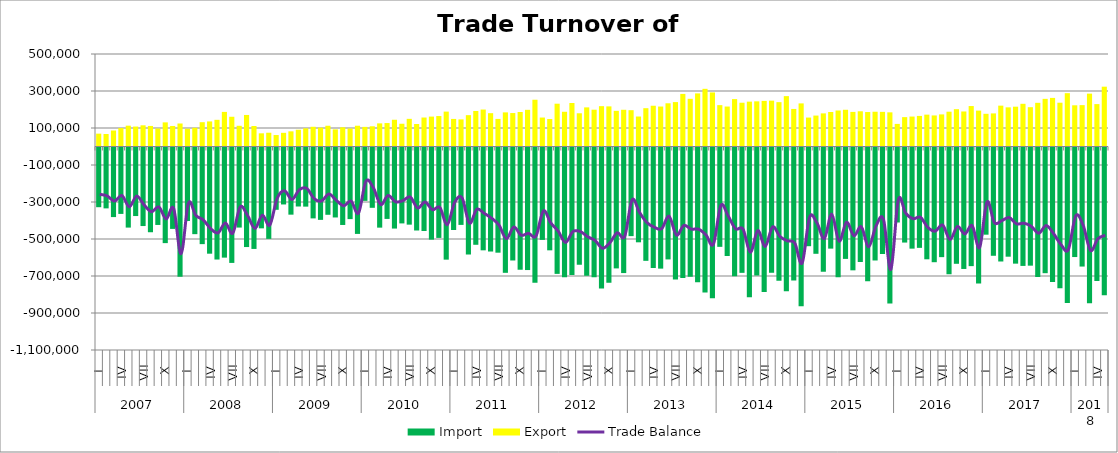
| Category | Import | Export |
|---|---|---|
| 0 | -328137.428 | 69473.835 |
| 1 | -334459.902 | 67469.561 |
| 2 | -381545.727 | 86485.258 |
| 3 | -364407.83 | 99579.043 |
| 4 | -438345.425 | 112612.284 |
| 5 | -375919.942 | 107918.489 |
| 6 | -429942.484 | 114501.191 |
| 7 | -463469.136 | 111126.511 |
| 8 | -424050.769 | 97183.969 |
| 9 | -522267.672 | 130413.835 |
| 10 | -445390.926 | 110997.546 |
| 11 | -704213.005 | 124348.947 |
| 12 | -402575.025 | 96157.037 |
| 13 | -473805.365 | 101214.427 |
| 14 | -527726.957 | 131397.232 |
| 15 | -579390.37 | 135532.592 |
| 16 | -610953.408 | 144223.295 |
| 17 | -600700.531 | 187019.429 |
| 18 | -629238.431 | 160784.767 |
| 19 | -438214.751 | 112046.47 |
| 20 | -543482.238 | 170475.427 |
| 21 | -553710.327 | 110823.513 |
| 22 | -442400.172 | 71226.822 |
| 23 | -499342.768 | 74444.228 |
| 24 | -342172.891 | 61992.595 |
| 25 | -313305.2 | 73882.564 |
| 26 | -368421.542 | 81964.131 |
| 27 | -324331.62 | 90575.384 |
| 28 | -325013.796 | 98333.759 |
| 29 | -388587.943 | 106636.938 |
| 30 | -396599.106 | 102008.498 |
| 31 | -369105.39 | 112226.511 |
| 32 | -383616.972 | 92627.175 |
| 33 | -424156.143 | 103821.906 |
| 34 | -392445.75 | 97243.451 |
| 35 | -472487.714 | 112309.489 |
| 36 | -293895.433 | 106064.492 |
| 37 | -331405.786 | 109307.304 |
| 38 | -438593.88 | 125094.217 |
| 39 | -391466.377 | 126732.826 |
| 40 | -443586.207 | 144566.325 |
| 41 | -415754.856 | 123019.4 |
| 42 | -422418.39 | 149517.049 |
| 43 | -454069.86 | 121491.454 |
| 44 | -456766.108 | 156666.699 |
| 45 | -503426.607 | 161726.515 |
| 46 | -494134.733 | 164687.607 |
| 47 | -611604.197 | 188598.168 |
| 48 | -451309.458 | 149010.644 |
| 49 | -423793.525 | 146578.748 |
| 50 | -583825.022 | 169493.189 |
| 51 | -531280.086 | 191970.173 |
| 52 | -561216.825 | 199783.493 |
| 53 | -567722.238 | 180198.594 |
| 54 | -573950.28 | 149150.663 |
| 55 | -682821.526 | 184407.918 |
| 56 | -616128.006 | 180852.789 |
| 57 | -666126.682 | 186641.23 |
| 58 | -667818.752 | 198251.768 |
| 59 | -736741.388 | 252796.62 |
| 60 | -504795.744 | 156548.304 |
| 61 | -561245.241 | 148452.793 |
| 62 | -688545.632 | 231354.031 |
| 63 | -706187.659 | 187713.44 |
| 64 | -694827.44 | 235062.822 |
| 65 | -639198.689 | 179645.423 |
| 66 | -699314.296 | 211478.747 |
| 67 | -707051.188 | 198935.781 |
| 68 | -768121.772 | 218103.736 |
| 69 | -737103.652 | 216869.809 |
| 70 | -658928.109 | 192707.068 |
| 71 | -684156.84 | 198511.792 |
| 72 | -484510.166 | 196270.253 |
| 73 | -517895.062 | 162100.421 |
| 74 | -618028.057 | 207058.123 |
| 75 | -656766.022 | 220319.968 |
| 76 | -660133.83 | 216011.247 |
| 77 | -610381.872 | 233583.127 |
| 78 | -718870.489 | 240016.286 |
| 79 | -710962.361 | 284268.477 |
| 80 | -704339.98 | 257853.114 |
| 81 | -734189.374 | 287023.64 |
| 82 | -789551.275 | 311739.566 |
| 83 | -820086.931 | 292254.741 |
| 84 | -542427.286 | 223612.854 |
| 85 | -591950.372 | 216056.361 |
| 86 | -701034.248 | 256202.016 |
| 87 | -682942.999 | 236606.206 |
| 88 | -814368.234 | 242506.121 |
| 89 | -697796.037 | 244083.524 |
| 90 | -787009.075 | 246465.522 |
| 91 | -682549.858 | 247769.838 |
| 92 | -726340.963 | 239731.245 |
| 93 | -782290.909 | 272322.182 |
| 94 | -724680.114 | 202926.728 |
| 95 | -862879.859 | 233012.969 |
| 96 | -538891.152 | 156419.793 |
| 97 | -579977.504 | 167210.896 |
| 98 | -676965.059 | 179075.373 |
| 99 | -552058.464 | 186554.958 |
| 100 | -706417.657 | 194612.062 |
| 101 | -607536.095 | 198583.755 |
| 102 | -669370.322 | 187036.287 |
| 103 | -624263.369 | 190362.202 |
| 104 | -728605.63 | 186333.061 |
| 105 | -616128.302 | 187914.12 |
| 106 | -581222.627 | 187288.327 |
| 107 | -848666.858 | 184620.727 |
| 108 | -410772.702 | 122160.969 |
| 109 | -519251.619 | 158749.443 |
| 110 | -552107.01 | 161900.102 |
| 111 | -547894.926 | 165302.85 |
| 112 | -609712.575 | 172239.015 |
| 113 | -625481.307 | 167884.862 |
| 114 | -598068.122 | 173574.954 |
| 115 | -690996.664 | 188142.545 |
| 116 | -634056.88 | 201743.962 |
| 117 | -661956.245 | 189333.815 |
| 118 | -646662.84 | 218689.735 |
| 119 | -740091.479 | 194004.02 |
| 120 | -476633.63 | 176770.495 |
| 121 | -590689.289 | 178910.081 |
| 122 | -621589.906 | 220843.521 |
| 123 | -595661.909 | 211605.86 |
| 124 | -633218.654 | 215234.782 |
| 125 | -645486.277 | 230813.253 |
| 126 | -644134.453 | 212474.806 |
| 127 | -704960.062 | 236122.257 |
| 128 | -684784.163 | 257521.119 |
| 129 | -733096.775 | 262736.792 |
| 130 | -766834.92 | 236697.74 |
| 131 | -845325.921 | 288236.739 |
| 132 | -597547.543 | 222730.176 |
| 133 | -648938.913 | 223674.133 |
| 134 | -847912.618 | 285793.704 |
| 135 | -727406.311 | 229156.774 |
| 136 | -803426.78 | 323345.406 |